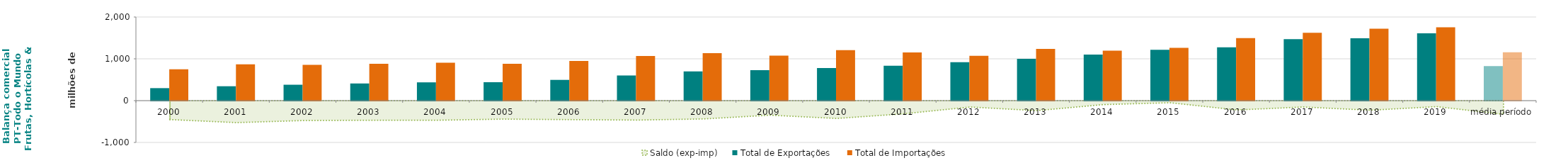
| Category | Total de Exportações  | Total de Importações  |
|---|---|---|
| 2000 | 298.97 | 751.669 |
| 2001 | 344.273 | 870.081 |
| 2002 | 380.48 | 856.16 |
| 2003 | 410.523 | 880.226 |
| 2004 | 437.374 | 906.434 |
| 2005 | 440.977 | 882.633 |
| 2006 | 496.484 | 950.801 |
| 2007 | 601.746 | 1066.43 |
| 2008 | 699.012 | 1136.896 |
| 2009 | 729.671 | 1077.488 |
| 2010 | 780.307 | 1206.18 |
| 2011 | 836.622 | 1152.087 |
| 2012 | 920.934 | 1073.394 |
| 2013 | 999.936 | 1238.777 |
| 2014 | 1101.402 | 1196.038 |
| 2015 | 1213.991 | 1263.516 |
| 2016 | 1273.506 | 1496.085 |
| 2017 | 1469.71 | 1621.929 |
| 2018 | 1492.933 | 1721.854 |
| 2019 | 1612.206 | 1755.978 |
| média período | 827.053 | 1155.233 |